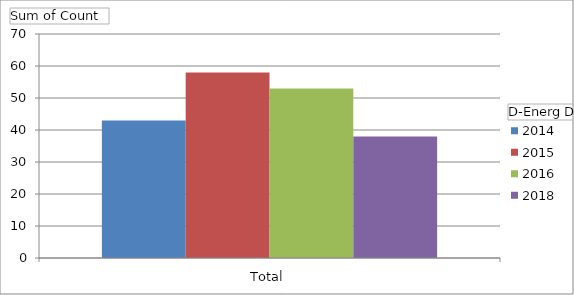
| Category | 2014 | 2015 | 2016 | 2018 |
|---|---|---|---|---|
| Total | 43 | 58 | 53 | 38 |